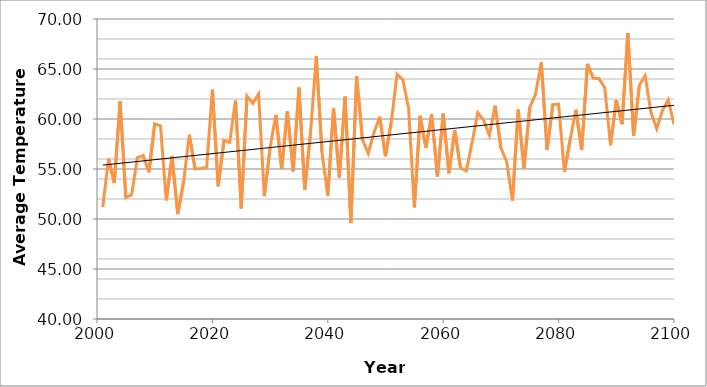
| Category | A2 |
|---|---|
| 2001.0 | 51.201 |
| 2002.0 | 56.044 |
| 2003.0 | 53.609 |
| 2004.0 | 61.759 |
| 2005.0 | 52.151 |
| 2006.0 | 52.425 |
| 2007.0 | 56.14 |
| 2008.0 | 56.35 |
| 2009.0 | 54.667 |
| 2010.0 | 59.527 |
| 2011.0 | 59.326 |
| 2012.0 | 51.865 |
| 2013.0 | 56.291 |
| 2014.0 | 50.493 |
| 2015.0 | 53.685 |
| 2016.0 | 58.419 |
| 2017.0 | 55.006 |
| 2018.0 | 55.053 |
| 2019.0 | 55.159 |
| 2020.0 | 62.929 |
| 2021.0 | 53.276 |
| 2022.0 | 57.864 |
| 2023.0 | 57.646 |
| 2024.0 | 61.844 |
| 2025.0 | 51.064 |
| 2026.0 | 62.301 |
| 2027.0 | 61.565 |
| 2028.0 | 62.496 |
| 2029.0 | 52.286 |
| 2030.0 | 57.119 |
| 2031.0 | 60.42 |
| 2032.0 | 55.022 |
| 2033.0 | 60.782 |
| 2034.0 | 54.763 |
| 2035.0 | 63.131 |
| 2036.0 | 52.911 |
| 2037.0 | 58.566 |
| 2038.0 | 66.292 |
| 2039.0 | 56.64 |
| 2040.0 | 52.324 |
| 2041.0 | 61.084 |
| 2042.0 | 54.153 |
| 2043.0 | 62.24 |
| 2044.0 | 49.618 |
| 2045.0 | 64.27 |
| 2046.0 | 57.943 |
| 2047.0 | 56.561 |
| 2048.0 | 58.62 |
| 2049.0 | 60.22 |
| 2050.0 | 56.278 |
| 2051.0 | 59.698 |
| 2052.0 | 64.459 |
| 2053.0 | 63.927 |
| 2054.0 | 61.07 |
| 2055.0 | 51.17 |
| 2056.0 | 60.312 |
| 2057.0 | 57.114 |
| 2058.0 | 60.454 |
| 2059.0 | 54.23 |
| 2060.0 | 60.534 |
| 2061.0 | 54.574 |
| 2062.0 | 58.885 |
| 2063.0 | 55.125 |
| 2064.0 | 54.81 |
| 2065.0 | 57.637 |
| 2066.0 | 60.629 |
| 2067.0 | 59.882 |
| 2068.0 | 58.383 |
| 2069.0 | 61.327 |
| 2070.0 | 57.126 |
| 2071.0 | 55.738 |
| 2072.0 | 51.847 |
| 2073.0 | 60.935 |
| 2074.0 | 55.063 |
| 2075.0 | 61.165 |
| 2076.0 | 62.476 |
| 2077.0 | 65.671 |
| 2078.0 | 56.899 |
| 2079.0 | 61.444 |
| 2080.0 | 61.495 |
| 2081.0 | 54.711 |
| 2082.0 | 57.942 |
| 2083.0 | 60.924 |
| 2084.0 | 56.905 |
| 2085.0 | 65.514 |
| 2086.0 | 64.094 |
| 2087.0 | 64.026 |
| 2088.0 | 63.126 |
| 2089.0 | 57.369 |
| 2090.0 | 61.9 |
| 2091.0 | 59.484 |
| 2092.0 | 68.601 |
| 2093.0 | 58.303 |
| 2094.0 | 63.387 |
| 2095.0 | 64.319 |
| 2096.0 | 60.681 |
| 2097.0 | 59.022 |
| 2098.0 | 60.859 |
| 2099.0 | 61.918 |
| 2100.0 | 59.452 |